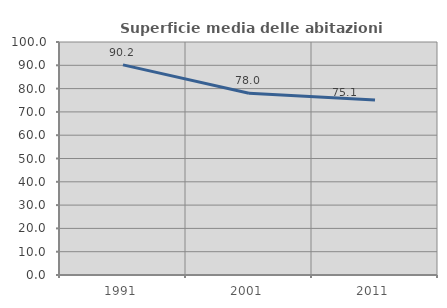
| Category | Superficie media delle abitazioni occupate |
|---|---|
| 1991.0 | 90.183 |
| 2001.0 | 78.012 |
| 2011.0 | 75.106 |